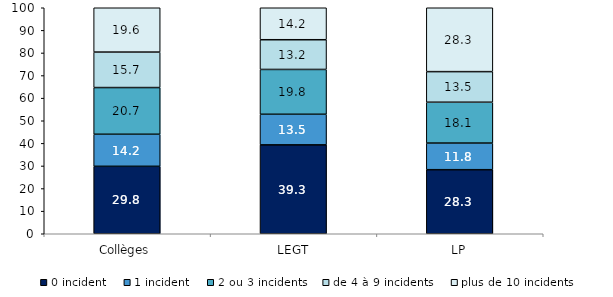
| Category | 0 incident | 1 incident | 2 ou 3 incidents | de 4 à 9 incidents  | plus de 10 incidents |
|---|---|---|---|---|---|
| Collèges | 29.84 | 14.19 | 20.66 | 15.7 | 19.61 |
| LEGT | 39.33 | 13.54 | 19.83 | 13.15 | 14.16 |
| LP | 28.34 | 11.79 | 18.07 | 13.53 | 28.27 |